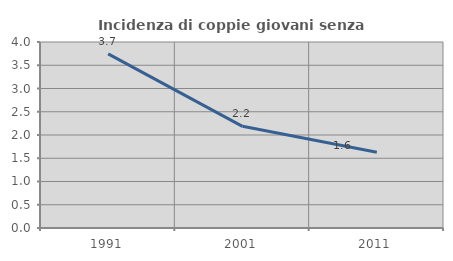
| Category | Incidenza di coppie giovani senza figli |
|---|---|
| 1991.0 | 3.744 |
| 2001.0 | 2.187 |
| 2011.0 | 1.629 |